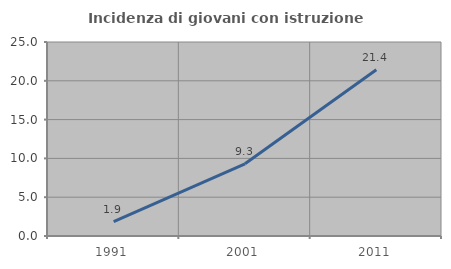
| Category | Incidenza di giovani con istruzione universitaria |
|---|---|
| 1991.0 | 1.852 |
| 2001.0 | 9.302 |
| 2011.0 | 21.429 |